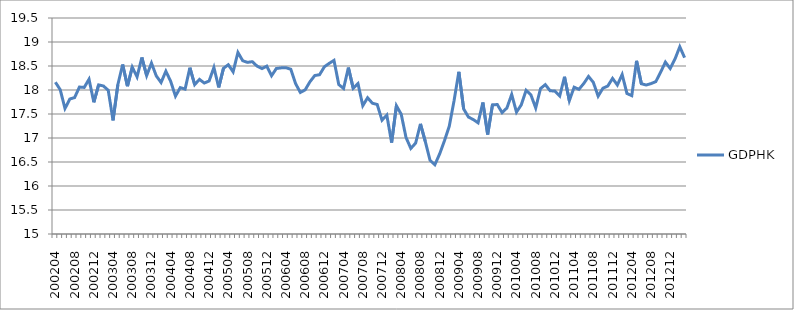
| Category | GDPHK |
|---|---|
| 200204.0 | 18.162 |
| 200205.0 | 18.007 |
| 200206.0 | 17.615 |
| 200207.0 | 17.812 |
| 200208.0 | 17.842 |
| 200209.0 | 18.062 |
| 200210.0 | 18.053 |
| 200211.0 | 18.225 |
| 200212.0 | 17.743 |
| 200301.0 | 18.106 |
| 200302.0 | 18.084 |
| 200303.0 | 17.994 |
| 200304.0 | 17.366 |
| 200305.0 | 18.11 |
| 200306.0 | 18.532 |
| 200307.0 | 18.079 |
| 200308.0 | 18.475 |
| 200309.0 | 18.274 |
| 200310.0 | 18.678 |
| 200311.0 | 18.3 |
| 200312.0 | 18.561 |
| 200401.0 | 18.295 |
| 200402.0 | 18.156 |
| 200403.0 | 18.392 |
| 200404.0 | 18.181 |
| 200405.0 | 17.872 |
| 200406.0 | 18.05 |
| 200407.0 | 18.018 |
| 200408.0 | 18.464 |
| 200409.0 | 18.112 |
| 200410.0 | 18.221 |
| 200411.0 | 18.145 |
| 200412.0 | 18.188 |
| 200501.0 | 18.469 |
| 200502.0 | 18.054 |
| 200503.0 | 18.453 |
| 200504.0 | 18.526 |
| 200505.0 | 18.378 |
| 200506.0 | 18.783 |
| 200507.0 | 18.61 |
| 200508.0 | 18.576 |
| 200509.0 | 18.59 |
| 200510.0 | 18.497 |
| 200511.0 | 18.446 |
| 200512.0 | 18.497 |
| 200601.0 | 18.297 |
| 200602.0 | 18.448 |
| 200603.0 | 18.461 |
| 200604.0 | 18.464 |
| 200605.0 | 18.433 |
| 200606.0 | 18.134 |
| 200607.0 | 17.949 |
| 200608.0 | 18.003 |
| 200609.0 | 18.172 |
| 200610.0 | 18.301 |
| 200611.0 | 18.319 |
| 200612.0 | 18.484 |
| 200701.0 | 18.555 |
| 200702.0 | 18.617 |
| 200703.0 | 18.113 |
| 200704.0 | 18.032 |
| 200705.0 | 18.467 |
| 200706.0 | 18.037 |
| 200707.0 | 18.133 |
| 200708.0 | 17.673 |
| 200709.0 | 17.838 |
| 200710.0 | 17.724 |
| 200711.0 | 17.698 |
| 200712.0 | 17.372 |
| 200801.0 | 17.477 |
| 200802.0 | 16.904 |
| 200803.0 | 17.672 |
| 200804.0 | 17.495 |
| 200805.0 | 17.011 |
| 200806.0 | 16.783 |
| 200807.0 | 16.893 |
| 200808.0 | 17.294 |
| 200809.0 | 16.932 |
| 200810.0 | 16.537 |
| 200811.0 | 16.442 |
| 200812.0 | 16.669 |
| 200901.0 | 16.945 |
| 200902.0 | 17.244 |
| 200903.0 | 17.774 |
| 200904.0 | 18.379 |
| 200905.0 | 17.605 |
| 200906.0 | 17.436 |
| 200907.0 | 17.384 |
| 200908.0 | 17.317 |
| 200909.0 | 17.74 |
| 200910.0 | 17.074 |
| 200911.0 | 17.691 |
| 200912.0 | 17.697 |
| 201001.0 | 17.529 |
| 201002.0 | 17.624 |
| 201003.0 | 17.908 |
| 201004.0 | 17.539 |
| 201005.0 | 17.691 |
| 201006.0 | 17.994 |
| 201007.0 | 17.898 |
| 201008.0 | 17.625 |
| 201009.0 | 18.03 |
| 201010.0 | 18.112 |
| 201011.0 | 17.984 |
| 201012.0 | 17.978 |
| 201101.0 | 17.874 |
| 201102.0 | 18.275 |
| 201103.0 | 17.778 |
| 201104.0 | 18.058 |
| 201105.0 | 18.014 |
| 201106.0 | 18.135 |
| 201107.0 | 18.282 |
| 201108.0 | 18.158 |
| 201109.0 | 17.871 |
| 201110.0 | 18.038 |
| 201111.0 | 18.082 |
| 201112.0 | 18.242 |
| 201201.0 | 18.104 |
| 201202.0 | 18.322 |
| 201203.0 | 17.927 |
| 201204.0 | 17.882 |
| 201205.0 | 18.608 |
| 201206.0 | 18.13 |
| 201207.0 | 18.104 |
| 201208.0 | 18.133 |
| 201209.0 | 18.174 |
| 201210.0 | 18.369 |
| 201211.0 | 18.581 |
| 201212.0 | 18.449 |
| 201301.0 | 18.646 |
| 201302.0 | 18.901 |
| 201303.0 | 18.674 |